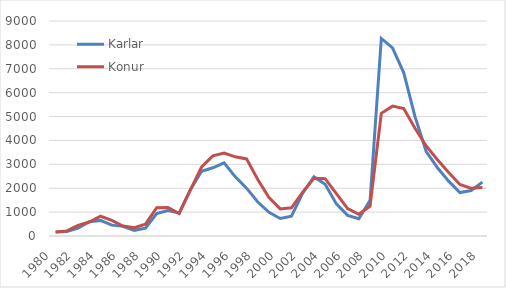
| Category | Karlar | Konur |
|---|---|---|
| 1980.0 | 162.11 | 169.201 |
| 1981.0 | 192.873 | 214.538 |
| 1982.0 | 325.791 | 443.186 |
| 1983.0 | 600.417 | 586.5 |
| 1984.0 | 652.917 | 827.75 |
| 1985.0 | 454.5 | 650.167 |
| 1986.0 | 403.917 | 418.917 |
| 1987.0 | 236.667 | 347.417 |
| 1988.0 | 324.667 | 494.917 |
| 1989.0 | 937.833 | 1187.333 |
| 1990.0 | 1063.083 | 1192.25 |
| 1991.0 | 958.583 | 941.917 |
| 1992.0 | 1934.167 | 1933.667 |
| 1993.0 | 2712.583 | 2888.833 |
| 1994.0 | 2856.583 | 3352.083 |
| 1995.0 | 3062.917 | 3475.5 |
| 1996.0 | 2476.583 | 3314.417 |
| 1997.0 | 2003 | 3227.417 |
| 1998.0 | 1421.917 | 2366.5 |
| 1999.0 | 990.083 | 1612 |
| 2000.0 | 731 | 1134 |
| 2001.0 | 830 | 1179 |
| 2002.0 | 1794 | 1837 |
| 2003.0 | 2474 | 2419 |
| 2004.0 | 2166 | 2398 |
| 2005.0 | 1343 | 1776 |
| 2006.0 | 866 | 1150 |
| 2007.0 | 721.417 | 910.833 |
| 2008.0 | 1491.333 | 1253.167 |
| 2009.0 | 8269.75 | 5137 |
| 2010.0 | 7872.917 | 5435.75 |
| 2011.0 | 6831.667 | 5335.667 |
| 2012.0 | 4996.5 | 4508.333 |
| 2013.0 | 3536 | 3768 |
| 2014.0 | 2858 | 3194.583 |
| 2015.0 | 2296.083 | 2659 |
| 2016.0 | 1820.333 | 2158.667 |
| 2017.0 | 1902.333 | 1996.667 |
| 2018.0 | 2254.833 | 2027.667 |